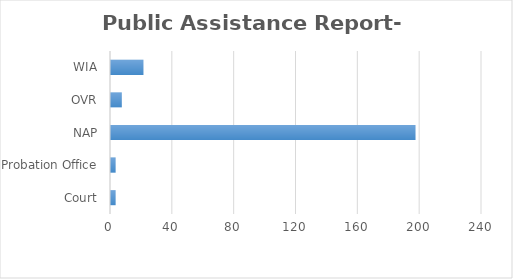
| Category | Series 0 |
|---|---|
| Court | 3 |
| Probation Office | 3 |
| NAP | 197 |
| OVR | 7 |
| WIA | 21 |